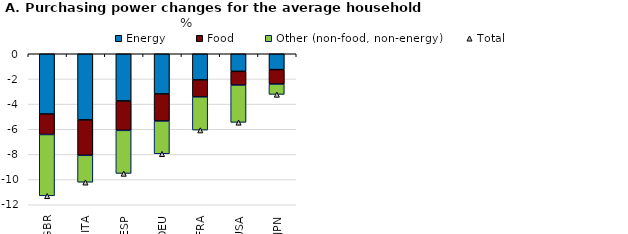
| Category | Energy | Food | Other (non-food, non-energy) |
|---|---|---|---|
| GBR | -4.787 | -1.631 | -4.871 |
| ITA | -5.256 | -2.815 | -2.139 |
| ESP | -3.754 | -2.333 | -3.425 |
| DEU | -3.192 | -2.152 | -2.604 |
| FRA | -2.079 | -1.348 | -2.638 |
| USA | -1.398 | -1.088 | -2.964 |
| JPN | -1.259 | -1.15 | -0.821 |